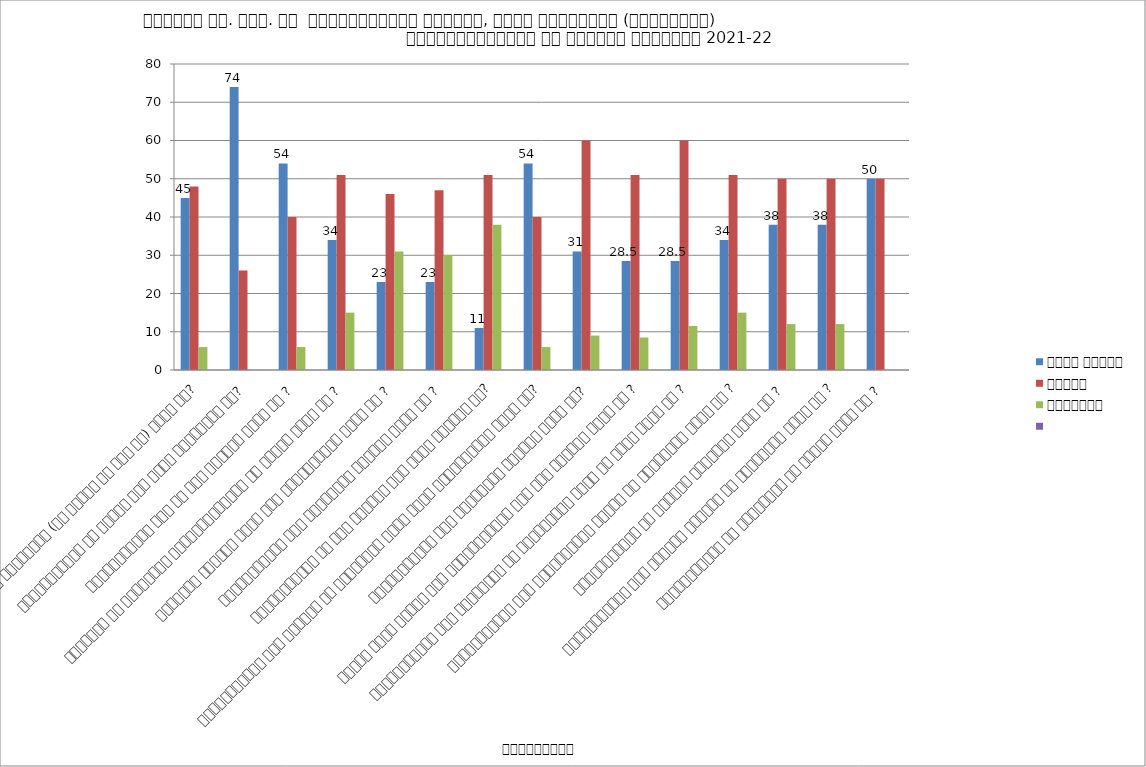
| Category | बहुत अच्छा  | अच्छा  | सामान्य | Series 3 |
|---|---|---|---|---|
| महाविद्यालय में शिक्षा व्यवस्था (जो कोर्स चल रहे है) कैसी है? | 45 | 48 | 6 |  |
| महाविद्यालय की ईमारत में कैसा परिवर्तन है? | 74 | 26 | 0 |  |
| महाविद्यालय में हो रहा शिक्षण कैसा है ? | 54 | 40 | 6 |  |
| शिक्षको का व्यव्हार विद्यार्थियों के प्रति कैसा है ?  | 34 | 51 | 15 |  |
| शिक्षको द्वारा दिया गया मार्गदर्शन कैसा है ? | 23 | 46 | 31 |  |
| महाविद्यालय में ग्रंथालय सुविधा कैसी है ? | 23 | 47 | 30 |  |
| महाविद्यालय की खेल सुविधा में कैसी प्रगति है? | 11 | 51 | 38 |  |
| महाविद्यालय में अध्ययन के अतिरिक्त होने वाली गतिविधियाँ कैसी है? | 54 | 40 | 6 |  |
| महाविद्यालय में स्वास्थय सुविधा कैसी है? | 31 | 60 | 9 |  |
| पिछले पांच वर्षो में महाविद्यालय में हुई प्रगति कैसी है ? | 28.5 | 51 | 8.5 |  |
| महाविद्यालय में प्रतिभाओ को प्रदर्शित करने के अवसर कैसे है ? | 28.5 | 60 | 11.5 |  |
| महाविद्यालय में प्रयोगशाला उपकरण की व्यवस्था कैसी है ? | 34 | 51 | 15 |  |
| महाविद्यालय का आतंरिक प्रांगन कैसा है ? | 38 | 50 | 12 |  |
| महाविद्यालय में साइकिल स्टैंड की व्यवस्था कैसी है ? | 38 | 50 | 12 |  |
| महाविद्यालय के कार्यालय का कार्य कैसा है ? | 50 | 50 | 0 |  |